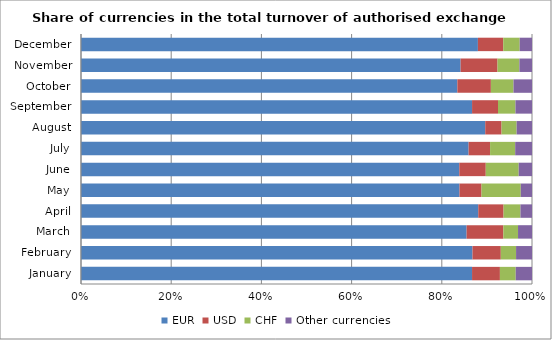
| Category | EUR | USD | CHF | Other currencies |
|---|---|---|---|---|
| January | 86.707 | 6.178 | 3.505 | 3.61 |
| February | 86.802 | 6.282 | 3.382 | 3.533 |
| March | 85.497 | 8.15 | 3.257 | 3.097 |
| April | 88.085 | 5.609 | 3.743 | 2.563 |
| May | 83.923 | 4.885 | 8.703 | 2.489 |
| June | 83.88 | 5.868 | 7.302 | 2.95 |
| July | 85.943 | 4.761 | 5.569 | 3.727 |
| August | 89.631 | 3.616 | 3.345 | 3.408 |
| September | 86.71 | 5.749 | 3.872 | 3.669 |
| October | 83.448 | 7.435 | 5.015 | 4.103 |
| November | 84.171 | 8.187 | 4.848 | 2.794 |
| December | 88.005 | 5.616 | 3.651 | 2.727 |